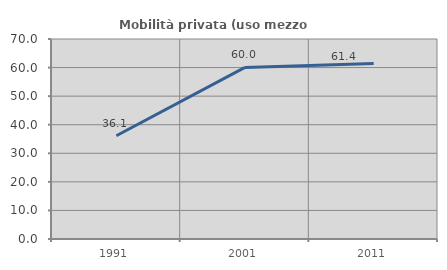
| Category | Mobilità privata (uso mezzo privato) |
|---|---|
| 1991.0 | 36.129 |
| 2001.0 | 60.044 |
| 2011.0 | 61.404 |